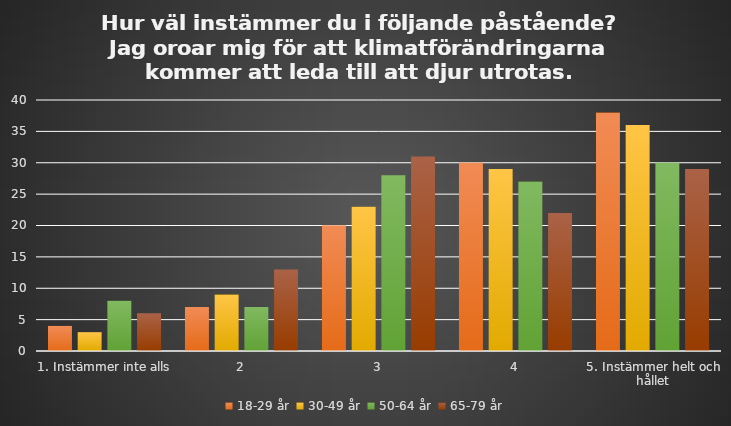
| Category | 18-29 år | 30-49 år | 50-64 år | 65-79 år |
|---|---|---|---|---|
| 1. Instämmer inte alls | 4 | 3 | 8 | 6 |
| 2 | 7 | 9 | 7 | 13 |
| 3 | 20 | 23 | 28 | 31 |
| 4 | 30 | 29 | 27 | 22 |
| 5. Instämmer helt och hållet | 38 | 36 | 30 | 29 |